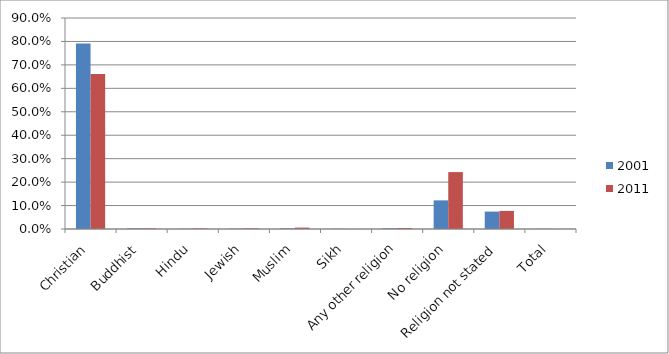
| Category | 2001 | 2011 |
|---|---|---|
| Christian | 0.791 | 0.661 |
| Buddhist | 0.003 | 0.003 |
| Hindu | 0.001 | 0.002 |
| Jewish | 0.002 | 0.003 |
| Muslim | 0.003 | 0.006 |
| Sikh | 0.001 | 0 |
| Any other religion | 0.003 | 0.004 |
| No religion | 0.122 | 0.243 |
| Religion not stated | 0.074 | 0.077 |
| Total | 0.001 | 0 |